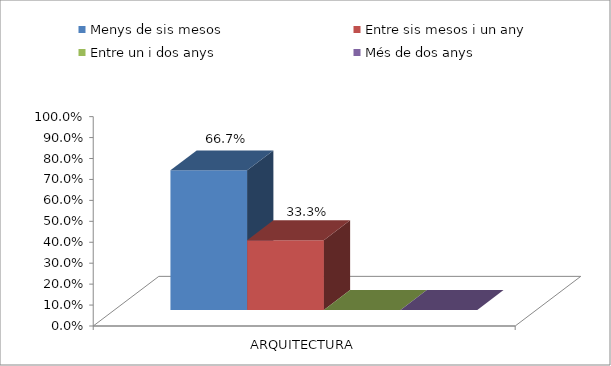
| Category | Menys de sis mesos | Entre sis mesos i un any | Entre un i dos anys | Més de dos anys |
|---|---|---|---|---|
| ARQUITECTURA | 0.667 | 0.333 | 0 | 0 |